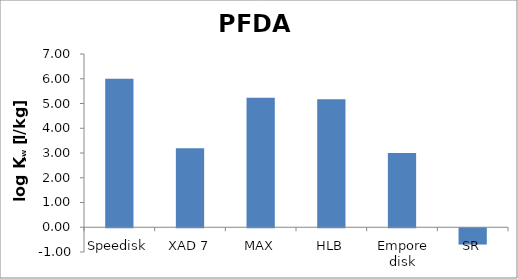
| Category | PFDA  |
|---|---|
| Speedisk | 5.999 |
| XAD 7 | 3.189 |
| MAX | 5.237 |
| HLB | 5.168 |
| Empore disk | 2.997 |
| SR | -0.659 |